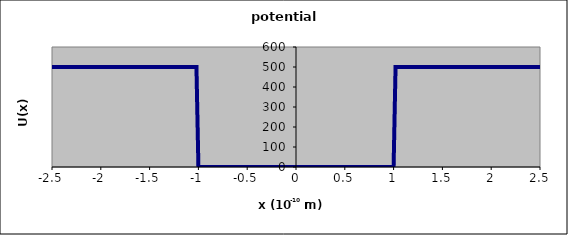
| Category | U(x) (eV) |
|---|---|
| -2.50000000000002 | 500 |
| -2.48000000000002 | 500 |
| -2.46000000000002 | 500 |
| -2.44000000000002 | 500 |
| -2.42000000000002 | 500 |
| -2.40000000000002 | 500 |
| -2.38000000000002 | 500 |
| -2.36000000000002 | 500 |
| -2.34000000000002 | 500 |
| -2.32000000000002 | 500 |
| -2.30000000000002 | 500 |
| -2.28000000000002 | 500 |
| -2.2600000000000198 | 500 |
| -2.2400000000000198 | 500 |
| -2.2200000000000197 | 500 |
| -2.2000000000000197 | 500 |
| -2.1800000000000197 | 500 |
| -2.1600000000000197 | 500 |
| -2.1400000000000197 | 500 |
| -2.1200000000000196 | 500 |
| -2.1000000000000196 | 500 |
| -2.0800000000000196 | 500 |
| -2.0600000000000196 | 500 |
| -2.0400000000000196 | 500 |
| -2.0200000000000196 | 500 |
| -2.0000000000000195 | 500 |
| -1.9800000000000195 | 500 |
| -1.9600000000000195 | 500 |
| -1.9400000000000195 | 500 |
| -1.9200000000000195 | 500 |
| -1.9000000000000195 | 500 |
| -1.8800000000000194 | 500 |
| -1.8600000000000194 | 500 |
| -1.8400000000000194 | 500 |
| -1.8200000000000194 | 500 |
| -1.8000000000000194 | 500 |
| -1.7800000000000193 | 500 |
| -1.7600000000000193 | 500 |
| -1.7400000000000193 | 500 |
| -1.7200000000000193 | 500 |
| -1.7000000000000193 | 500 |
| -1.6800000000000193 | 500 |
| -1.6600000000000192 | 500 |
| -1.6400000000000192 | 500 |
| -1.6200000000000192 | 500 |
| -1.6000000000000192 | 500 |
| -1.5800000000000192 | 500 |
| -1.5600000000000191 | 500 |
| -1.5400000000000191 | 500 |
| -1.5200000000000191 | 500 |
| -1.500000000000019 | 500 |
| -1.480000000000019 | 500 |
| -1.460000000000019 | 500 |
| -1.440000000000019 | 500 |
| -1.420000000000019 | 500 |
| -1.400000000000019 | 500 |
| -1.380000000000019 | 500 |
| -1.360000000000019 | 500 |
| -1.340000000000019 | 500 |
| -1.320000000000019 | 500 |
| -1.300000000000019 | 500 |
| -1.280000000000019 | 500 |
| -1.2600000000000189 | 500 |
| -1.2400000000000189 | 500 |
| -1.2200000000000188 | 500 |
| -1.2000000000000188 | 500 |
| -1.1800000000000188 | 500 |
| -1.1600000000000188 | 500 |
| -1.1400000000000188 | 500 |
| -1.1200000000000188 | 500 |
| -1.1000000000000187 | 500 |
| -1.0800000000000187 | 500 |
| -1.0600000000000187 | 500 |
| -1.0400000000000187 | 500 |
| -1.0200000000000187 | 500 |
| -1.0000000000000187 | 0 |
| -0.9800000000000186 | 0 |
| -0.9600000000000186 | 0 |
| -0.9400000000000186 | 0 |
| -0.9200000000000186 | 0 |
| -0.9000000000000186 | 0 |
| -0.8800000000000185 | 0 |
| -0.8600000000000185 | 0 |
| -0.8400000000000185 | 0 |
| -0.8200000000000185 | 0 |
| -0.8000000000000185 | 0 |
| -0.7800000000000185 | 0 |
| -0.7600000000000184 | 0 |
| -0.7400000000000184 | 0 |
| -0.7200000000000184 | 0 |
| -0.7000000000000184 | 0 |
| -0.6800000000000184 | 0 |
| -0.6600000000000183 | 0 |
| -0.6400000000000183 | 0 |
| -0.6200000000000183 | 0 |
| -0.6000000000000183 | 0 |
| -0.5800000000000183 | 0 |
| -0.5600000000000183 | 0 |
| -0.5400000000000182 | 0 |
| -0.5200000000000182 | 0 |
| -0.5000000000000182 | 0 |
| -0.4800000000000182 | 0 |
| -0.46000000000001817 | 0 |
| -0.44000000000001815 | 0 |
| -0.42000000000001814 | 0 |
| -0.4000000000000181 | 0 |
| -0.3800000000000181 | 0 |
| -0.3600000000000181 | 0 |
| -0.34000000000001807 | 0 |
| -0.32000000000001805 | 0 |
| -0.30000000000001803 | 0 |
| -0.280000000000018 | 0 |
| -0.260000000000018 | 0 |
| -0.240000000000018 | 0 |
| -0.22000000000001801 | 0 |
| -0.20000000000001802 | 0 |
| -0.18000000000001803 | 0 |
| -0.16000000000001804 | 0 |
| -0.14000000000001805 | 0 |
| -0.12000000000001805 | 0 |
| -0.10000000000001805 | 0 |
| -0.08000000000001804 | 0 |
| -0.06000000000001804 | 0 |
| -0.040000000000018035 | 0 |
| -0.020000000000018035 | 0 |
| -1.8034185256254887e-14 | 0 |
| 0.019999999999981966 | 0 |
| 0.03999999999998197 | 0 |
| 0.05999999999998197 | 0 |
| 0.07999999999998197 | 0 |
| 0.09999999999998198 | 0 |
| 0.11999999999998198 | 0 |
| 0.13999999999998197 | 0 |
| 0.15999999999998196 | 0 |
| 0.17999999999998195 | 0 |
| 0.19999999999998194 | 0 |
| 0.21999999999998193 | 0 |
| 0.23999999999998192 | 0 |
| 0.2599999999999819 | 0 |
| 0.27999999999998193 | 0 |
| 0.29999999999998195 | 0 |
| 0.31999999999998197 | 0 |
| 0.339999999999982 | 0 |
| 0.359999999999982 | 0 |
| 0.379999999999982 | 0 |
| 0.39999999999998204 | 0 |
| 0.41999999999998205 | 0 |
| 0.43999999999998207 | 0 |
| 0.4599999999999821 | 0 |
| 0.4799999999999821 | 0 |
| 0.4999999999999821 | 0 |
| 0.5199999999999821 | 0 |
| 0.5399999999999822 | 0 |
| 0.5599999999999822 | 0 |
| 0.5799999999999822 | 0 |
| 0.5999999999999822 | 0 |
| 0.6199999999999822 | 0 |
| 0.6399999999999822 | 0 |
| 0.6599999999999823 | 0 |
| 0.6799999999999823 | 0 |
| 0.6999999999999823 | 0 |
| 0.7199999999999823 | 0 |
| 0.7399999999999823 | 0 |
| 0.7599999999999824 | 0 |
| 0.7799999999999824 | 0 |
| 0.7999999999999824 | 0 |
| 0.8199999999999824 | 0 |
| 0.8399999999999824 | 0 |
| 0.8599999999999824 | 0 |
| 0.8799999999999825 | 0 |
| 0.8999999999999825 | 0 |
| 0.9199999999999825 | 0 |
| 0.9399999999999825 | 0 |
| 0.9599999999999825 | 0 |
| 0.9799999999999826 | 0 |
| 0.9999999999999826 | 0 |
| 1.0199999999999825 | 500 |
| 1.0399999999999825 | 500 |
| 1.0599999999999825 | 500 |
| 1.0799999999999825 | 500 |
| 1.0999999999999825 | 500 |
| 1.1199999999999826 | 500 |
| 1.1399999999999826 | 500 |
| 1.1599999999999826 | 500 |
| 1.1799999999999826 | 500 |
| 1.1999999999999826 | 500 |
| 1.2199999999999827 | 500 |
| 1.2399999999999827 | 500 |
| 1.2599999999999827 | 500 |
| 1.2799999999999827 | 500 |
| 1.2999999999999827 | 500 |
| 1.3199999999999827 | 500 |
| 1.3399999999999828 | 500 |
| 1.3599999999999828 | 500 |
| 1.3799999999999828 | 500 |
| 1.3999999999999828 | 500 |
| 1.4199999999999828 | 500 |
| 1.4399999999999828 | 500 |
| 1.4599999999999829 | 500 |
| 1.4799999999999829 | 500 |
| 1.499999999999983 | 500 |
| 1.519999999999983 | 500 |
| 1.539999999999983 | 500 |
| 1.559999999999983 | 500 |
| 1.579999999999983 | 500 |
| 1.599999999999983 | 500 |
| 1.619999999999983 | 500 |
| 1.639999999999983 | 500 |
| 1.659999999999983 | 500 |
| 1.679999999999983 | 500 |
| 1.699999999999983 | 500 |
| 1.719999999999983 | 500 |
| 1.7399999999999831 | 500 |
| 1.7599999999999831 | 500 |
| 1.7799999999999832 | 500 |
| 1.7999999999999832 | 500 |
| 1.8199999999999832 | 500 |
| 1.8399999999999832 | 500 |
| 1.8599999999999832 | 500 |
| 1.8799999999999832 | 500 |
| 1.8999999999999833 | 500 |
| 1.9199999999999833 | 500 |
| 1.9399999999999833 | 500 |
| 1.9599999999999833 | 500 |
| 1.9799999999999833 | 500 |
| 1.9999999999999833 | 500 |
| 2.019999999999983 | 500 |
| 2.039999999999983 | 500 |
| 2.059999999999983 | 500 |
| 2.079999999999983 | 500 |
| 2.099999999999983 | 500 |
| 2.1199999999999832 | 500 |
| 2.1399999999999832 | 500 |
| 2.1599999999999833 | 500 |
| 2.1799999999999833 | 500 |
| 2.1999999999999833 | 500 |
| 2.2199999999999833 | 500 |
| 2.2399999999999833 | 500 |
| 2.2599999999999834 | 500 |
| 2.2799999999999834 | 500 |
| 2.2999999999999834 | 500 |
| 2.3199999999999834 | 500 |
| 2.3399999999999834 | 500 |
| 2.3599999999999834 | 500 |
| 2.3799999999999835 | 500 |
| 2.3999999999999835 | 500 |
| 2.4199999999999835 | 500 |
| 2.4399999999999835 | 500 |
| 2.4599999999999835 | 500 |
| 2.4799999999999836 | 500 |
| 2.4999999999999836 | 500 |